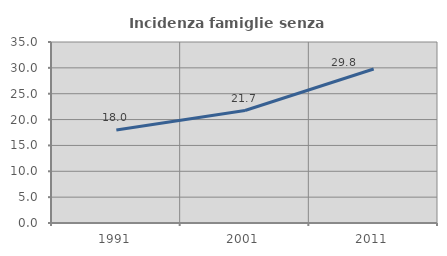
| Category | Incidenza famiglie senza nuclei |
|---|---|
| 1991.0 | 17.975 |
| 2001.0 | 21.747 |
| 2011.0 | 29.776 |